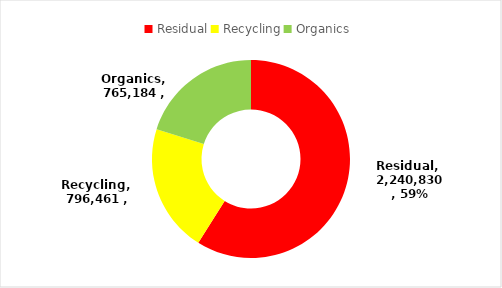
| Category | Series 0 |
|---|---|
| Residual | 2240830.37 |
| Recycling | 796460.84 |
| Organics | 765184.12 |